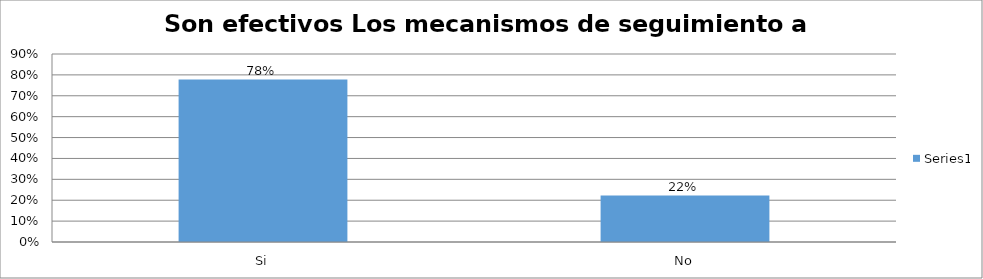
| Category | Series 0 |
|---|---|
| Si | 0.778 |
| No | 0.222 |